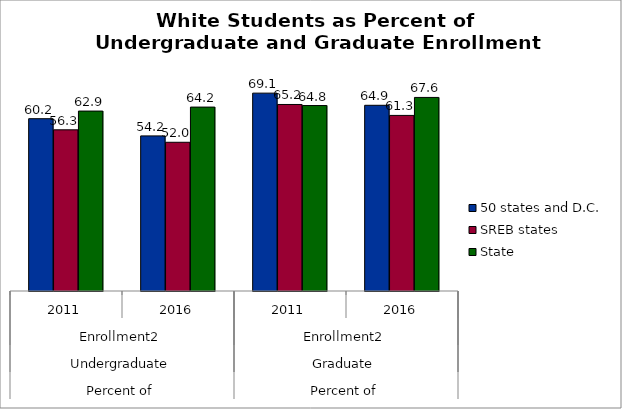
| Category | 50 states and D.C. | SREB states | State |
|---|---|---|---|
| 0 | 60.191 | 56.308 | 62.858 |
| 1 | 54.182 | 51.955 | 64.248 |
| 2 | 69.121 | 65.159 | 64.789 |
| 3 | 64.877 | 61.342 | 67.625 |